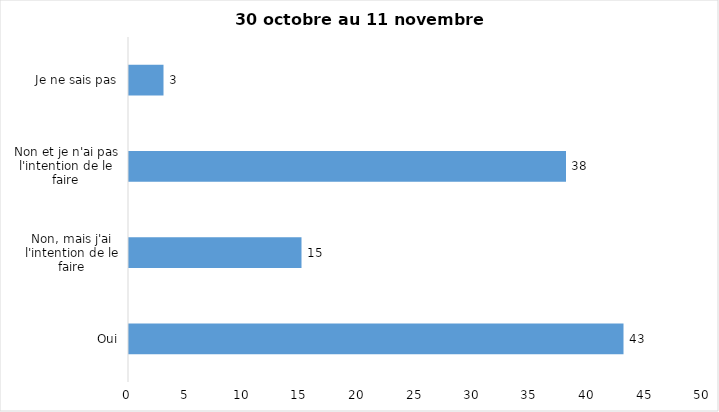
| Category | Series 0 |
|---|---|
| Oui | 43 |
| Non, mais j'ai l'intention de le faire | 15 |
| Non et je n'ai pas l'intention de le faire | 38 |
| Je ne sais pas | 3 |